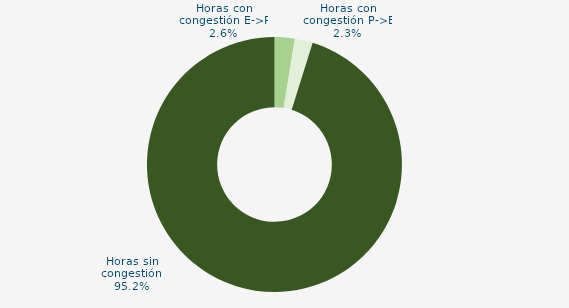
| Category | Horas con congestión E->P |
|---|---|
| Horas con congestión E->P | 2.554 |
| Horas con congestión P->E | 2.285 |
| Horas sin congestión | 95.161 |